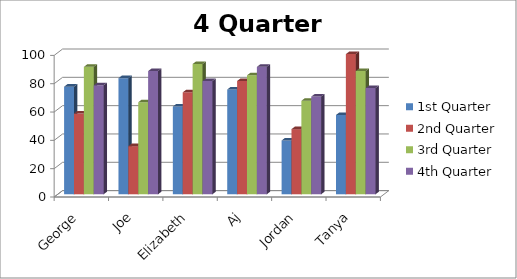
| Category | 1st Quarter | 2nd Quarter | 3rd Quarter | 4th Quarter |
|---|---|---|---|---|
| George | 76 | 57 | 90 | 77 |
| Joe | 82 | 34 | 65 | 87 |
| Elizabeth | 62 | 72 | 92 | 80 |
| Aj | 74 | 80 | 84 | 90 |
| Jordan | 38 | 46 | 66 | 69 |
| Tanya | 56 | 99 | 87 | 75 |